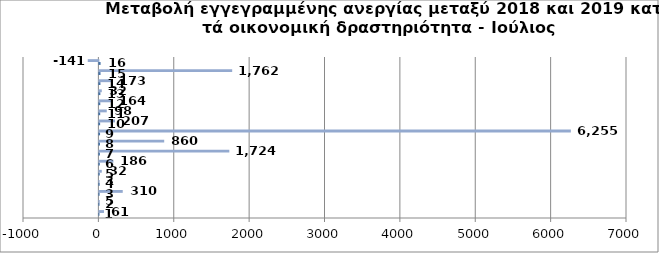
| Category | Series 0 | Series 1 |
|---|---|---|
| 0 | 1 | 61 |
| 1 | 2 | 5 |
| 2 | 3 | 310 |
| 3 | 4 | 3 |
| 4 | 5 | 32 |
| 5 | 6 | 186 |
| 6 | 7 | 1724 |
| 7 | 8 | 860 |
| 8 | 9 | 6255 |
| 9 | 10 | 207 |
| 10 | 11 | 98 |
| 11 | 12 | 164 |
| 12 | 13 | 32 |
| 13 | 14 | 173 |
| 14 | 15 | 1762 |
| 15 | 16 | -141 |